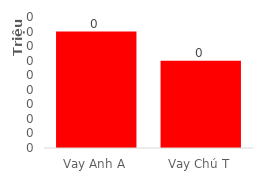
| Category | Total |
|---|---|
| Vay Anh A | 4 |
| Vay Chú T | 3 |